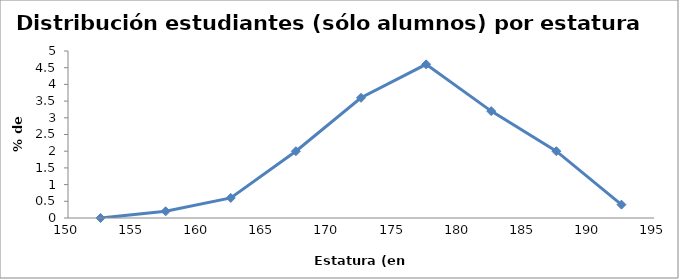
| Category | Series 0 |
|---|---|
| 152.5 | 0 |
| 157.5 | 0.2 |
| 162.5 | 0.6 |
| 167.5 | 2 |
| 172.5 | 3.6 |
| 177.5 | 4.6 |
| 182.5 | 3.2 |
| 187.5 | 2 |
| 192.5 | 0.4 |